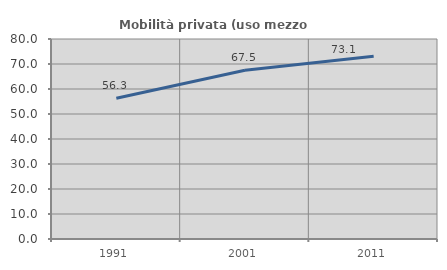
| Category | Mobilità privata (uso mezzo privato) |
|---|---|
| 1991.0 | 56.272 |
| 2001.0 | 67.474 |
| 2011.0 | 73.069 |